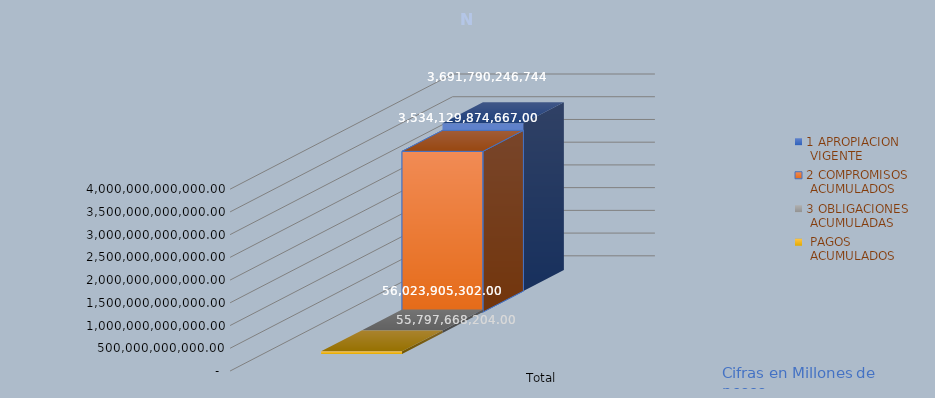
| Category | 1 APROPIACION
 VIGENTE | 2 COMPROMISOS
 ACUMULADOS | 3 OBLIGACIONES
 ACUMULADAS |  PAGOS
 ACUMULADOS |
|---|---|---|---|---|
| Total | 3691790246744 | 3534129874667 | 56023905302 | 55797668204 |